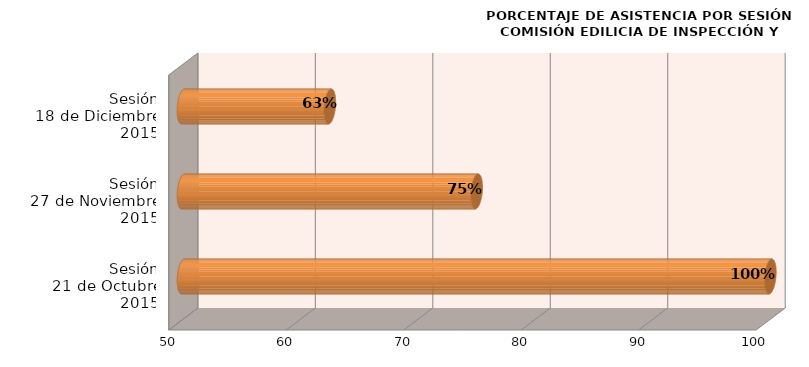
| Category | Series 0 |
|---|---|
| Sesión
 21 de Octubre 2015 | 100 |
| Sesión
27 de Noviembre 2015 | 75 |
| Sesión
18 de Diciembre 2015 | 62.5 |